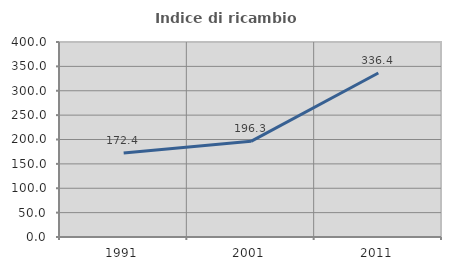
| Category | Indice di ricambio occupazionale  |
|---|---|
| 1991.0 | 172.436 |
| 2001.0 | 196.262 |
| 2011.0 | 336.364 |